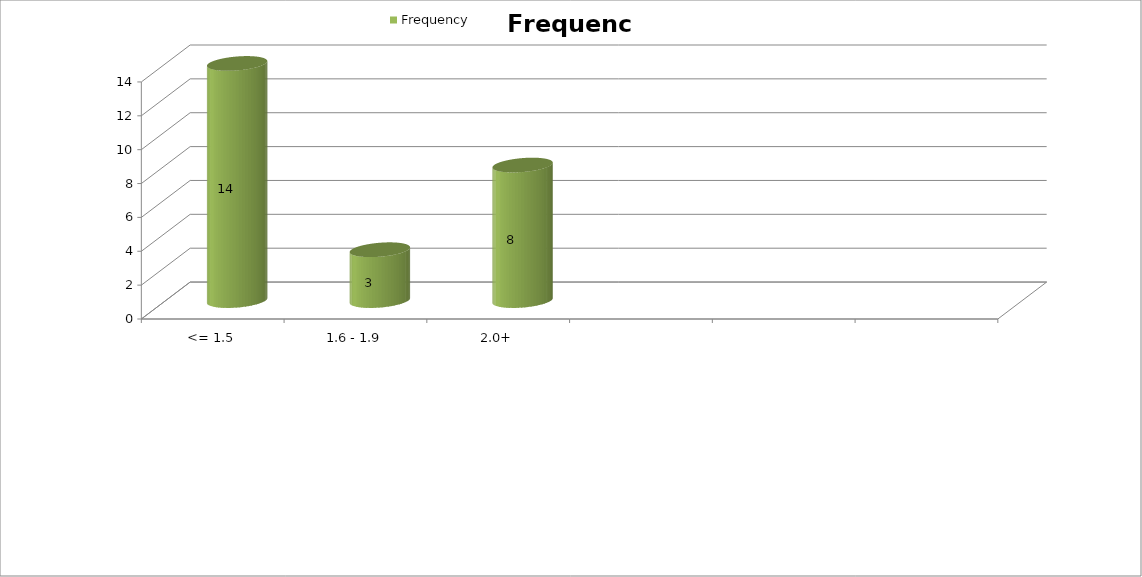
| Category | Frequency |
|---|---|
| <= 1.5 | 14 |
| 1.6 - 1.9 | 3 |
| 2.0+ | 8 |